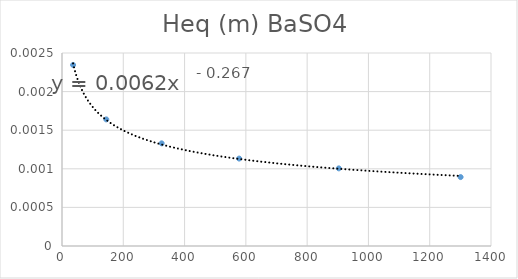
| Category | Series 0 |
|---|---|
| 36.1335 | 0.002 |
| 144.534 | 0.002 |
| 325.20149999999995 | 0.001 |
| 578.136 | 0.001 |
| 903.3374999999999 | 0.001 |
| 1300.8059999999998 | 0.001 |